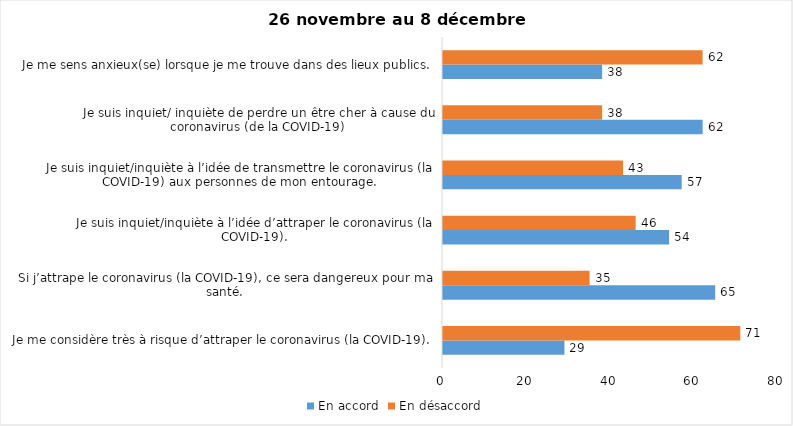
| Category | En accord | En désaccord |
|---|---|---|
| Je me considère très à risque d’attraper le coronavirus (la COVID-19). | 29 | 71 |
| Si j’attrape le coronavirus (la COVID-19), ce sera dangereux pour ma santé. | 65 | 35 |
| Je suis inquiet/inquiète à l’idée d’attraper le coronavirus (la COVID-19). | 54 | 46 |
| Je suis inquiet/inquiète à l’idée de transmettre le coronavirus (la COVID-19) aux personnes de mon entourage. | 57 | 43 |
| Je suis inquiet/ inquiète de perdre un être cher à cause du coronavirus (de la COVID-19) | 62 | 38 |
| Je me sens anxieux(se) lorsque je me trouve dans des lieux publics. | 38 | 62 |